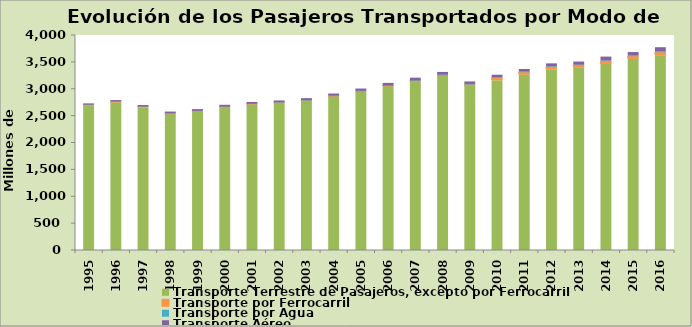
| Category | Transporte Terrestre de Pasajeros, excepto por Ferrocarril | Transporte por Ferrocarril | Transporte por Agua | Transporte Aéreo |
|---|---|---|---|---|
| 1995.0 | 2691 | 6.678 | 5.098 | 25.192 |
| 1996.0 | 2750 | 6.727 | 6.394 | 26.493 |
| 1997.0 | 2658 | 5.092 | 6.228 | 28.896 |
| 1998.0 | 2536 | 1.576 | 7.179 | 30.922 |
| 1999.0 | 2580 | 0.801 | 7.854 | 32.662 |
| 2000.0 | 2660 | 0.334 | 7.4 | 33.974 |
| 2001.0 | 2713 | 0.242 | 7.507 | 33.673 |
| 2002.0 | 2740 | 0.237 | 8.715 | 33.19 |
| 2003.0 | 2780 | 0.27 | 9.843 | 35.287 |
| 2004.0 | 2860 | 0.253 | 11.744 | 39.422 |
| 2005.0 | 2950 | 0.253 | 11.461 | 42.176 |
| 2006.0 | 3050 | 0.26 | 11.985 | 46.705 |
| 2007.0 | 3141 | 0.288 | 12.761 | 52.217 |
| 2008.0 | 3238 | 8.915 | 12.597 | 53.3 |
| 2009.0 | 3050 | 28 | 10.985 | 46.971 |
| 2010.0 | 3160 | 40.398 | 11.793 | 48.698 |
| 2011.0 | 3264.3 | 41.922 | 10.814 | 50.764 |
| 2012.0 | 3363 | 43.83 | 10.268 | 55.153 |
| 2013.0 | 3391 | 45.288 | 9.969 | 60.007 |
| 2014.0 | 3459 | 53.594 | 12.679 | 73.265 |
| 2015.0 | 3558 | 47.888 | 11.948 | 65.135 |
| 2016.0 | 3623 | 55.5 | 14.203 | 80.247 |